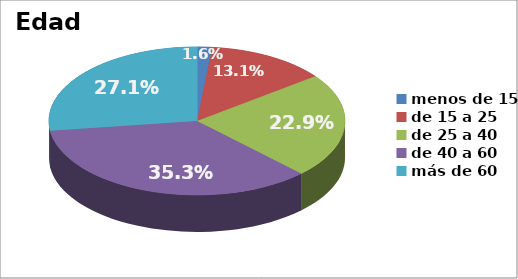
| Category | Series 0 |
|---|---|
| menos de 15 | 0.016 |
| de 15 a 25 | 0.131 |
| de 25 a 40 | 0.229 |
| de 40 a 60 | 0.353 |
| más de 60 | 0.271 |